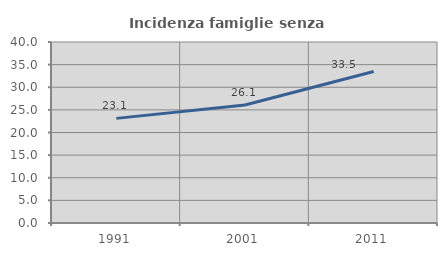
| Category | Incidenza famiglie senza nuclei |
|---|---|
| 1991.0 | 23.12 |
| 2001.0 | 26.075 |
| 2011.0 | 33.483 |